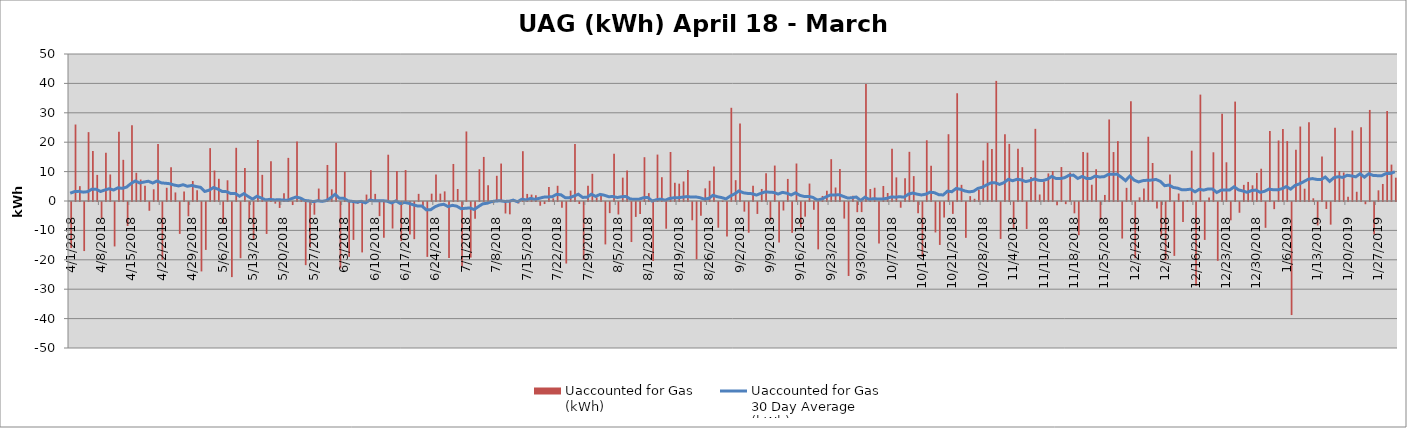
| Category | Uaccounted for Gas 
(kWh) |
|---|---|
| 4/1/18 | -15658125 |
| 4/2/18 | 26015403 |
| 4/3/18 | 5051025 |
| 4/4/18 | -16688992 |
| 4/5/18 | 23421405 |
| 4/6/18 | 16971481 |
| 4/7/18 | 8877600 |
| 4/8/18 | -5487145 |
| 4/9/18 | 16451917 |
| 4/10/18 | 9025739 |
| 4/11/18 | -15117433 |
| 4/12/18 | 23564728 |
| 4/13/18 | 14007820 |
| 4/14/18 | -8170911 |
| 4/15/18 | 25738298 |
| 4/16/18 | 9588799 |
| 4/17/18 | 7309420 |
| 4/18/18 | 5202558 |
| 4/19/18 | -2981597 |
| 4/20/18 | 3982564 |
| 4/21/18 | 19405629 |
| 4/22/18 | -19671075 |
| 4/23/18 | 4497848 |
| 4/24/18 | 11481412 |
| 4/25/18 | 2910766 |
| 4/26/18 | -10844341 |
| 4/27/18 | 3254680 |
| 4/28/18 | -4864854 |
| 4/29/18 | 6794079 |
| 4/30/18 | 3621745 |
| 5/1/18 | -23614366 |
| 5/2/18 | -16292802 |
| 5/3/18 | 17981897 |
| 5/4/18 | 10364219 |
| 5/5/18 | 7554162 |
| 5/6/18 | -7345702 |
| 5/7/18 | 7043708 |
| 5/8/18 | -25547286 |
| 5/9/18 | 18094809 |
| 5/10/18 | -19127397 |
| 5/11/18 | 11223263 |
| 5/12/18 | -5746042 |
| 5/13/18 | -12827655 |
| 5/14/18 | 20774823 |
| 5/15/18 | 8899787 |
| 5/16/18 | -10860723 |
| 5/17/18 | 13518896 |
| 5/18/18 | -554376 |
| 5/19/18 | -2024676 |
| 5/20/18 | 2637353 |
| 5/21/18 | 14671991 |
| 5/22/18 | -1039536 |
| 5/23/18 | 20274431 |
| 5/24/18 | 1151581 |
| 5/25/18 | -21483294 |
| 5/26/18 | -15387521 |
| 5/27/18 | -4319399 |
| 5/28/18 | 4237444 |
| 5/29/18 | 282864 |
| 5/30/18 | 12257861 |
| 5/31/18 | 3962321 |
| 6/1/18 | 19802011 |
| 6/2/18 | -22597953 |
| 6/3/18 | 9947618 |
| 6/4/18 | -18647518 |
| 6/5/18 | -12895102 |
| 6/6/18 | -623278 |
| 6/7/18 | -17148640 |
| 6/8/18 | 2190769 |
| 6/9/18 | 10497982 |
| 6/10/18 | 2428479 |
| 6/11/18 | -4803975 |
| 6/12/18 | -12196700 |
| 6/13/18 | 15744325 |
| 6/14/18 | -9015839 |
| 6/15/18 | 10230907 |
| 6/16/18 | -13299647 |
| 6/17/18 | 10529943 |
| 6/18/18 | -11041294 |
| 6/19/18 | -12643875 |
| 6/20/18 | 2429972 |
| 6/21/18 | -1521838 |
| 6/22/18 | -18676547 |
| 6/23/18 | 2492544 |
| 6/24/18 | 9024949 |
| 6/25/18 | 2510797 |
| 6/26/18 | 3270316 |
| 6/27/18 | -19079133 |
| 6/28/18 | 12596768 |
| 6/29/18 | 4088036 |
| 6/30/18 | -21909346 |
| 7/1/18 | 23651297 |
| 7/2/18 | -18897699 |
| 7/3/18 | -5684340 |
| 7/4/18 | 10793161 |
| 7/5/18 | 14992216 |
| 7/6/18 | 5328674 |
| 7/7/18 | -387772 |
| 7/8/18 | 8571809 |
| 7/9/18 | 12737039 |
| 7/10/18 | -3907844 |
| 7/11/18 | -4193629 |
| 7/12/18 | 11977 |
| 7/13/18 | -509667 |
| 7/14/18 | 16938400 |
| 7/15/18 | 2407925 |
| 7/16/18 | 2176303 |
| 7/17/18 | 1947809 |
| 7/18/18 | -1269270 |
| 7/19/18 | -700348 |
| 7/20/18 | 4784543 |
| 7/21/18 | 909714 |
| 7/22/18 | 5181337 |
| 7/23/18 | -1938823 |
| 7/24/18 | -20930235 |
| 7/25/18 | 3537084 |
| 7/26/18 | 19387113 |
| 7/27/18 | -683119 |
| 7/28/18 | -19699830 |
| 7/29/18 | 5178632 |
| 7/30/18 | 9253570 |
| 7/31/18 | 1204190 |
| 8/1/18 | 2071529 |
| 8/2/18 | -14424980 |
| 8/3/18 | -3788383 |
| 8/4/18 | 16110116 |
| 8/5/18 | -4254295 |
| 8/6/18 | 7950015 |
| 8/7/18 | 10377892 |
| 8/8/18 | -13617791 |
| 8/9/18 | -5070129 |
| 8/10/18 | -4041653 |
| 8/11/18 | 14898316 |
| 8/12/18 | 2684458 |
| 8/13/18 | -20071923 |
| 8/14/18 | 15791240 |
| 8/15/18 | 8093404 |
| 8/16/18 | -9086258 |
| 8/17/18 | 16667947 |
| 8/18/18 | 6201336 |
| 8/19/18 | 5900633 |
| 8/20/18 | 6647370 |
| 8/21/18 | 10556113 |
| 8/22/18 | -6217733 |
| 8/23/18 | -19486109 |
| 8/24/18 | -4672964 |
| 8/25/18 | 4304958 |
| 8/26/18 | 6882725 |
| 8/27/18 | 11694792 |
| 8/28/18 | -8745572 |
| 8/29/18 | 97484 |
| 8/30/18 | -11741351 |
| 8/31/18 | 31707278 |
| 9/1/18 | 7081505 |
| 9/2/18 | 26357046 |
| 9/3/18 | -3280487 |
| 9/4/18 | -10444309 |
| 9/5/18 | 5214065 |
| 9/6/18 | -4058832 |
| 9/7/18 | 4100091 |
| 9/8/18 | 9411837 |
| 9/9/18 | -6398435 |
| 9/10/18 | 12055888 |
| 9/11/18 | -13735059 |
| 9/12/18 | -2892620 |
| 9/13/18 | 7510791 |
| 9/14/18 | -10501346 |
| 9/15/18 | 12753518 |
| 9/16/18 | -8679732 |
| 9/17/18 | -4985240 |
| 9/18/18 | 5930516 |
| 9/19/18 | -2649942 |
| 9/20/18 | -16110488 |
| 9/21/18 | 1718111 |
| 9/22/18 | 3481917 |
| 9/23/18 | 14229011 |
| 9/24/18 | 4596930 |
| 9/25/18 | 10926057 |
| 9/26/18 | -5646864 |
| 9/27/18 | -25159984 |
| 9/28/18 | 1822076 |
| 9/29/18 | -3458565 |
| 9/30/18 | -3434220 |
| 10/1/18 | 39782640 |
| 10/2/18 | 4072595 |
| 10/3/18 | 4506771 |
| 10/4/18 | -14157373 |
| 10/5/18 | 5115037 |
| 10/6/18 | 2725924 |
| 10/7/18 | 17764863 |
| 10/8/18 | 8033320 |
| 10/9/18 | -1950123 |
| 10/10/18 | 7714816 |
| 10/11/18 | 16729824 |
| 10/12/18 | 8466193 |
| 10/13/18 | -3805235 |
| 10/14/18 | -18662057 |
| 10/15/18 | 20659393 |
| 10/16/18 | 11973842 |
| 10/17/18 | -10361714 |
| 10/18/18 | -14598962 |
| 10/19/18 | -5282757 |
| 10/20/18 | 22715968 |
| 10/21/18 | -4040582 |
| 10/22/18 | 36652189 |
| 10/23/18 | 5497041 |
| 10/24/18 | -12191072 |
| 10/25/18 | 1659320 |
| 10/26/18 | 762856 |
| 10/27/18 | 3825791 |
| 10/28/18 | 13788744 |
| 10/29/18 | 19779590 |
| 10/30/18 | 17692175 |
| 10/31/18 | 40858013 |
| 11/1/18 | -12567744 |
| 11/2/18 | 22705528 |
| 11/3/18 | 19429131 |
| 11/4/18 | -9219883 |
| 11/5/18 | 17769728 |
| 11/6/18 | 11506003 |
| 11/7/18 | -9173772 |
| 11/8/18 | 8202522 |
| 11/9/18 | 24542920 |
| 11/10/18 | 2219983 |
| 11/11/18 | 6627537 |
| 11/12/18 | 9383116 |
| 11/13/18 | 10204886 |
| 11/14/18 | -1135092 |
| 11/15/18 | 11551553 |
| 11/16/18 | -736475 |
| 11/17/18 | 9666641 |
| 11/18/18 | -3854028 |
| 11/19/18 | -11295331 |
| 11/20/18 | 16635588 |
| 11/21/18 | 16456205 |
| 11/22/18 | 5529830 |
| 11/23/18 | 10805899 |
| 11/24/18 | -6319432 |
| 11/25/18 | 2062069 |
| 11/26/18 | 27736187 |
| 11/27/18 | 16653958 |
| 11/28/18 | 20361369 |
| 11/29/18 | -12427330 |
| 11/30/18 | 4473214 |
| 12/1/18 | 33963447 |
| 12/2/18 | -19131630 |
| 12/3/18 | 1242293 |
| 12/4/18 | 4245440 |
| 12/5/18 | 21855347 |
| 12/6/18 | 12918929 |
| 12/7/18 | -2206410 |
| 12/8/18 | -11653790 |
| 12/9/18 | -19786900 |
| 12/10/18 | 9054960 |
| 12/11/18 | -18327818 |
| 12/12/18 | 2547081 |
| 12/13/18 | -6809887 |
| 12/14/18 | 323195 |
| 12/15/18 | 17115328 |
| 12/16/18 | -28483085 |
| 12/17/18 | 36186688 |
| 12/18/18 | -12896189 |
| 12/19/18 | 1157179 |
| 12/20/18 | 16572421 |
| 12/21/18 | -20007798 |
| 12/22/18 | 29670256 |
| 12/23/18 | 13170489 |
| 12/24/18 | -6229326 |
| 12/25/18 | 33810918 |
| 12/26/18 | -3657500 |
| 12/27/18 | 5489427 |
| 12/28/18 | 6486861 |
| 12/29/18 | 5343546 |
| 12/30/18 | 9546206 |
| 12/31/18 | 10980907 |
| 1/1/19 | -8782391.722 |
| 1/2/19 | 23830098.556 |
| 1/3/19 | -2428306.944 |
| 1/4/19 | 20587904.556 |
| 1/5/19 | 24508092.222 |
| 1/6/19 | 20375283.722 |
| 1/7/19 | -38455202.808 |
| 1/8/19 | 17394649.389 |
| 1/9/19 | 25328570.111 |
| 1/10/19 | 4189173.111 |
| 1/11/19 | 26759207 |
| 1/12/19 | 921068.778 |
| 1/13/19 | -7967296 |
| 1/14/19 | 15139801.5 |
| 1/15/19 | -2368061.944 |
| 1/16/19 | -7701238.944 |
| 1/17/19 | 24940262.167 |
| 1/18/19 | 10185773.556 |
| 1/19/19 | 9702759.444 |
| 1/20/19 | 1453271 |
| 1/21/19 | 23957379 |
| 1/22/19 | 3144001 |
| 1/23/19 | 25060201 |
| 1/24/19 | -763466.583 |
| 1/25/19 | 30974131.833 |
| 1/26/19 | -11052279.5 |
| 1/27/19 | 3631294.833 |
| 1/28/19 | 5796023 |
| 1/29/19 | 30607796.444 |
| 1/30/19 | 12379617 |
| 1/31/19 | 7930550 |